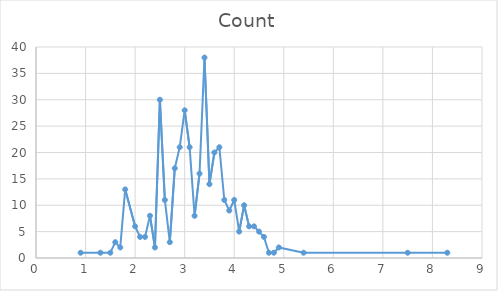
| Category | Count |
|---|---|
| 0.9 | 1 |
| 1.3 | 1 |
| 1.5 | 1 |
| 1.6 | 3 |
| 1.7 | 2 |
| 1.8 | 13 |
| 2.0 | 6 |
| 2.1 | 4 |
| 2.2 | 4 |
| 2.3 | 8 |
| 2.4 | 2 |
| 2.5 | 30 |
| 2.6 | 11 |
| 2.7 | 3 |
| 2.8 | 17 |
| 2.9 | 21 |
| 3.0 | 28 |
| 3.1 | 21 |
| 3.2 | 8 |
| 3.3 | 16 |
| 3.4 | 38 |
| 3.5 | 14 |
| 3.6 | 20 |
| 3.7 | 21 |
| 3.8 | 11 |
| 3.9 | 9 |
| 4.0 | 11 |
| 4.1 | 5 |
| 4.2 | 10 |
| 4.3 | 6 |
| 4.4 | 6 |
| 4.5 | 5 |
| 4.6 | 4 |
| 4.7 | 1 |
| 4.8 | 1 |
| 4.9 | 2 |
| 5.4 | 1 |
| 7.5 | 1 |
| 8.3 | 1 |